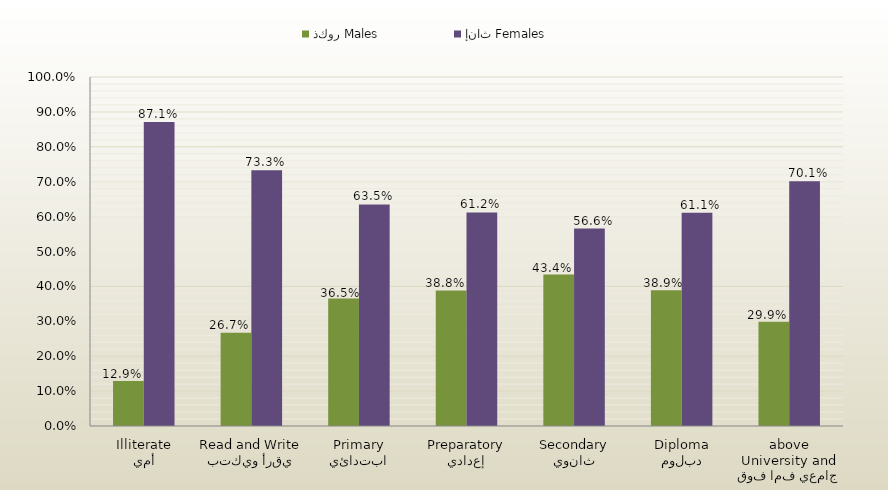
| Category | ذكور Males | إناث Females |
|---|---|---|
| أمي
Illiterate | 0.129 | 0.871 |
| يقرأ ويكتب
Read and Write | 0.267 | 0.733 |
| ابتدائي
Primary | 0.365 | 0.635 |
| إعدادي
Preparatory | 0.388 | 0.612 |
| ثانوي
Secondary | 0.434 | 0.566 |
| دبلوم
Diploma | 0.389 | 0.611 |
| جامعي فما فوق
University and above | 0.299 | 0.701 |